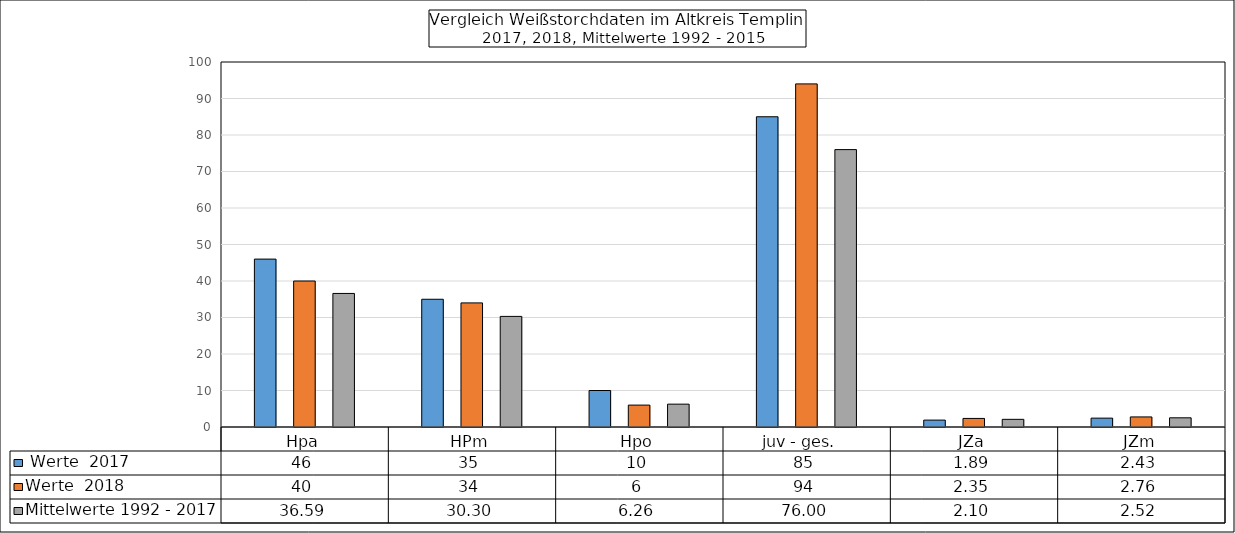
| Category |  Werte  2017 | Werte  2018 | Mittelwerte 1992 - 2017 |
|---|---|---|---|
| Hpa | 46 | 40 | 36.59 |
| HPm | 35 | 34 | 30.3 |
| Hpo | 10 | 6 | 6.26 |
| juv - ges.   | 85 | 94 | 76 |
| JZa | 1.89 | 2.35 | 2.1 |
| JZm | 2.43 | 2.76 | 2.52 |